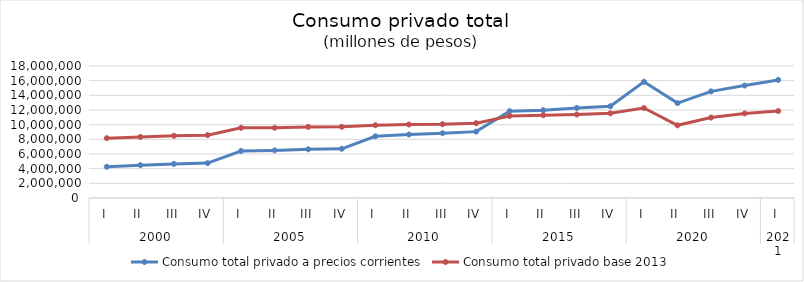
| Category | Consumo total privado a precios corrientes | Consumo total privado base 2013 |
|---|---|---|
| 0 | 4263531.107 | 8157438.066 |
| 1 | 4474206.1 | 8331383.823 |
| 2 | 4645625.193 | 8477802.709 |
| 3 | 4755867.825 | 8570829.89 |
| 4 | 6413184.589 | 9567052.33 |
| 5 | 6494144.926 | 9575918.986 |
| 6 | 6645985.693 | 9694559.321 |
| 7 | 6709080.812 | 9713069.886 |
| 8 | 8412215.215 | 9926204.815 |
| 9 | 8657106.709 | 10020489.144 |
| 10 | 8828312.715 | 10058075.745 |
| 11 | 9050447.952 | 10208543.237 |
| 12 | 11838397.71 | 11190193.285 |
| 13 | 11980122.296 | 11285003.496 |
| 14 | 12280111.267 | 11390191.179 |
| 15 | 12516390.291 | 11545449.586 |
| 16 | 15847956.592 | 12274927.5 |
| 17 | 12937505.062 | 9909664.003 |
| 18 | 14543723.224 | 10966542.787 |
| 19 | 15337497.763 | 11528915.96 |
| 20 | 16102986.223 | 11862929.218 |